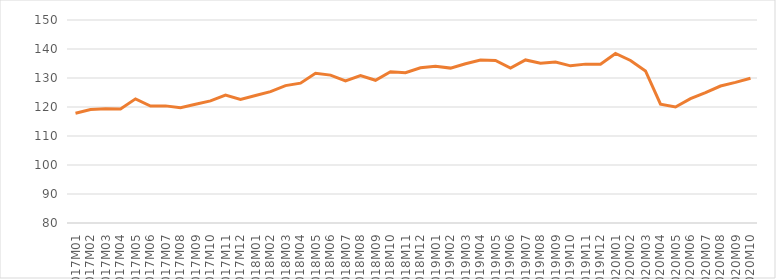
| Category | Säsongrensat |
|---|---|
| 2017M01 | 117.843 |
| 2017M02 | 119.129 |
| 2017M03 | 119.426 |
| 2017M04 | 119.328 |
| 2017M05 | 122.801 |
| 2017M06 | 120.311 |
| 2017M07 | 120.384 |
| 2017M08 | 119.716 |
| 2017M09 | 120.919 |
| 2017M10 | 122.118 |
| 2017M11 | 124.122 |
| 2017M12 | 122.596 |
| 2018M01 | 123.959 |
| 2018M02 | 125.311 |
| 2018M03 | 127.365 |
| 2018M04 | 128.228 |
| 2018M05 | 131.638 |
| 2018M06 | 130.988 |
| 2018M07 | 129.033 |
| 2018M08 | 130.817 |
| 2018M09 | 129.217 |
| 2018M10 | 132.16 |
| 2018M11 | 131.828 |
| 2018M12 | 133.505 |
| 2019M01 | 134.015 |
| 2019M02 | 133.413 |
| 2019M03 | 134.924 |
| 2019M04 | 136.212 |
| 2019M05 | 136.044 |
| 2019M06 | 133.398 |
| 2019M07 | 136.236 |
| 2019M08 | 135.092 |
| 2019M09 | 135.475 |
| 2019M10 | 134.195 |
| 2019M11 | 134.784 |
| 2019M12 | 134.725 |
| 2020M01 | 138.477 |
| 2020M02 | 136.053 |
| 2020M03 | 132.448 |
| 2020M04 | 120.981 |
| 2020M05 | 119.991 |
| 2020M06 | 122.901 |
| 2020M07 | 124.973 |
| 2020M08 | 127.239 |
| 2020M09 | 128.502 |
| 2020M10 | 129.907 |